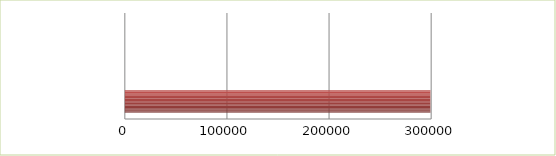
| Category | Series 0 | Series 1 |
|---|---|---|
| 0 | 2.5 | 299204 |
| 1 | 2.6 | 0 |
| 2 | 2.7 | 0 |